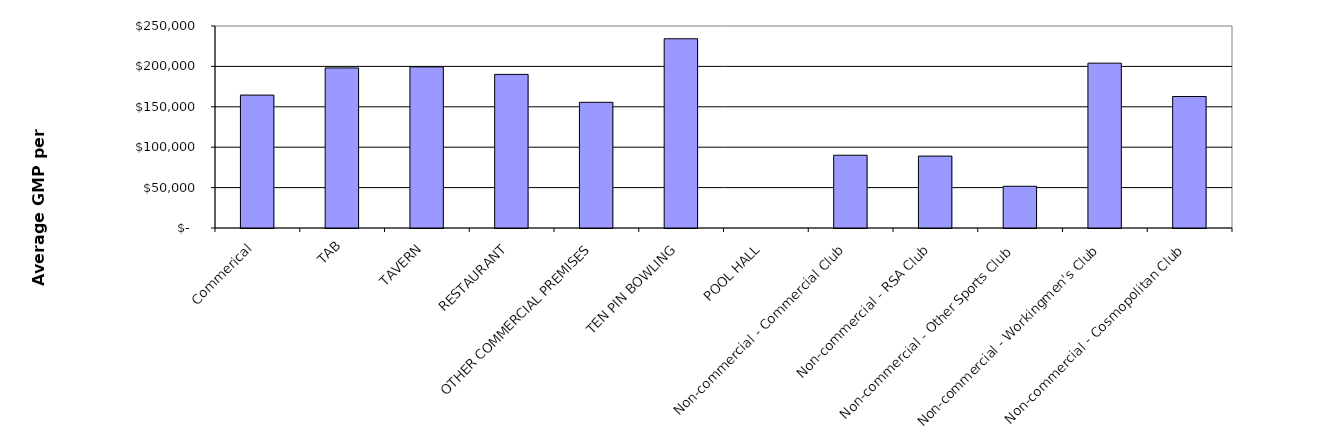
| Category | Series 0 |
|---|---|
| Commerical | 164521.776 |
| TAB | 198148.249 |
| TAVERN | 199409.081 |
| RESTAURANT | 190087.774 |
| OTHER COMMERCIAL PREMISES | 155552.281 |
| TEN PIN BOWLING | 234220.12 |
| POOL HALL | 0 |
| Non-commercial - Commercial Club | 90051.198 |
| Non-commercial - RSA Club | 89004.946 |
| Non-commercial - Other Sports Club | 51656.666 |
| Non-commercial - Workingmen's Club | 204042.888 |
| Non-commercial - Cosmopolitan Club | 162745.205 |